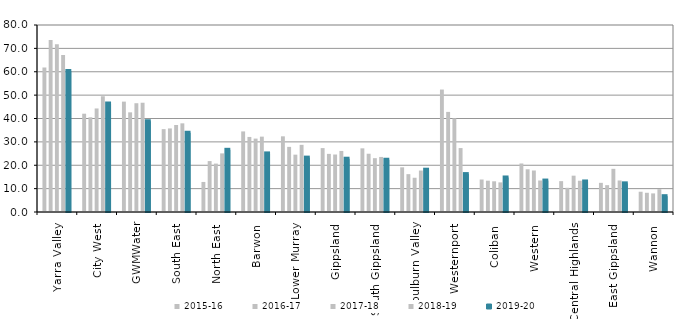
| Category | 2015-16 | 2016-17 | 2017-18 | 2018-19 | 2019-20 |
|---|---|---|---|---|---|
| Yarra Valley  | 61.838 | 73.556 | 71.723 | 67.173 | 60.347 |
| City West  | 42.051 | 40.509 | 44.297 | 49.533 | 46.42 |
| GWMWater | 47.223 | 42.633 | 46.534 | 46.744 | 38.827 |
| South East  | 35.455 | 35.748 | 37.223 | 37.928 | 33.9 |
| North East  | 12.85 | 21.78 | 20.703 | 25.076 | 26.605 |
| Barwon  | 34.473 | 32.113 | 31.408 | 32.24 | 25.068 |
| Lower Murray  | 32.374 | 27.862 | 24.531 | 28.731 | 23.265 |
| Gippsland  | 27.339 | 24.866 | 24.59 | 26.124 | 22.796 |
| South Gippsland  | 27.234 | 24.929 | 23.034 | 23.553 | 22.356 |
| Goulburn Valley  | 19.116 | 16.194 | 14.649 | 17.735 | 18.093 |
| Westernport  | 52.384 | 42.824 | 40.095 | 27.35 | 16.216 |
| Coliban  | 13.9 | 13.397 | 13.133 | 12.667 | 14.768 |
| Western  | 20.755 | 18.272 | 17.758 | 13.476 | 13.45 |
| Central Highlands  | 13.199 | 10.35 | 15.54 | 13.375 | 13.059 |
| East Gippsland  | 12.473 | 11.481 | 18.468 | 13.485 | 12.256 |
| Wannon  | 8.673 | 8.223 | 7.957 | 9.765 | 6.768 |